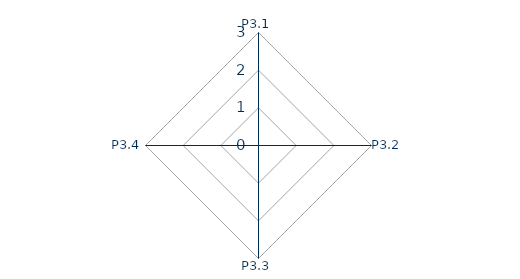
| Category | Series 0 |
|---|---|
| P3.1 | 0 |
| P3.2 | 0 |
| P3.3 | 0 |
| P3.4 | 0 |